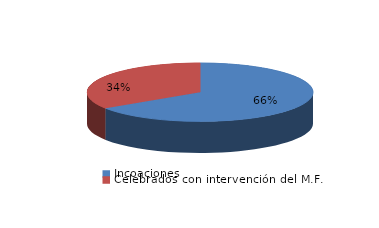
| Category | Series 0 |
|---|---|
| Incoaciones | 1948 |
| Celebrados con intervención del M.F. | 1017 |